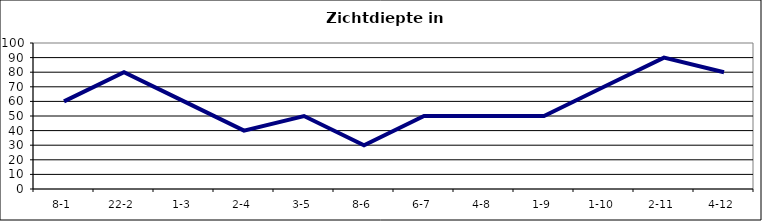
| Category | Zichtdiepte in cm |
|---|---|
| 8-1 | 60 |
| 22-2 | 80 |
| 1-3 | 60 |
| 2-4 | 40 |
| 3-5 | 50 |
| 8-6 | 30 |
| 6-7 | 50 |
| 4-8 | 50 |
| 1-9 | 50 |
| 1-10 | 70 |
| 2-11 | 90 |
| 4-12 | 80 |